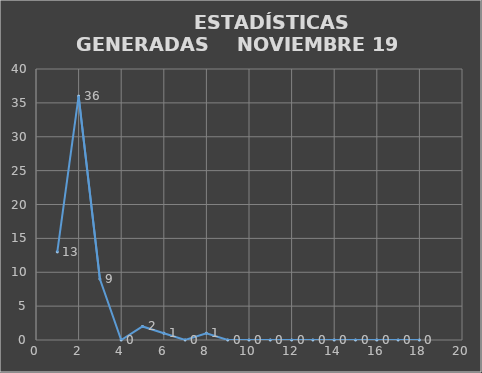
| Category |                   ESTADÍSTICAS GENERADAS     PERIODO NOVIEMBRE 19 CANTIDAD |
|---|---|
| 0 | 13 |
| 1 | 36 |
| 2 | 9 |
| 3 | 0 |
| 4 | 2 |
| 5 | 1 |
| 6 | 0 |
| 7 | 1 |
| 8 | 0 |
| 9 | 0 |
| 10 | 0 |
| 11 | 0 |
| 12 | 0 |
| 13 | 0 |
| 14 | 0 |
| 15 | 0 |
| 16 | 0 |
| 17 | 0 |